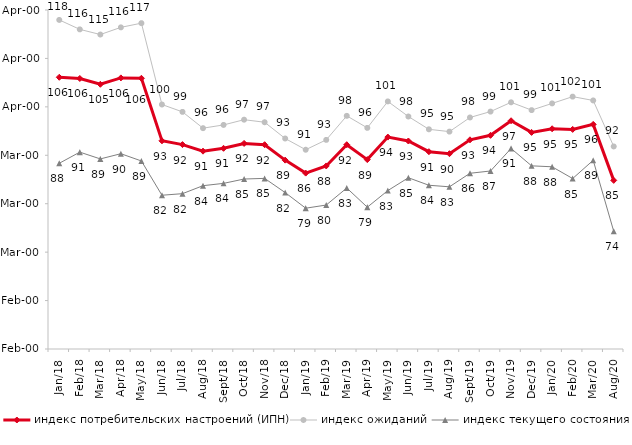
| Category | индекс потребительских настроений (ИПН) | Series 0 | индекс ожиданий | Series 3 | индекс текущего состояния |
|---|---|---|---|---|---|
| 2018-01-01 | 106.11 | 2018-01-01 | 117.95 | 2018-01-01 | 88.35 |
| 2018-02-01 | 105.86 | 2018-02-01 | 116 | 2018-02-01 | 90.65 |
| 2018-03-01 | 104.66 | 2018-03-01 | 114.933 | 2018-03-01 | 89.25 |
| 2018-04-01 | 105.98 | 2018-04-01 | 116.417 | 2018-04-01 | 90.325 |
| 2018-05-01 | 105.9 | 2018-05-01 | 117.283 | 2018-05-01 | 88.825 |
| 2018-06-01 | 92.99 | 2018-06-01 | 100.483 | 2018-06-01 | 81.75 |
| 2018-07-01 | 92.21 | 2018-07-01 | 98.967 | 2018-07-01 | 82.075 |
| 2018-08-01 | 90.85 | 2018-08-01 | 95.6 | 2018-08-01 | 83.725 |
| 2018-09-01 | 91.44 | 2018-09-01 | 96.267 | 2018-09-01 | 84.2 |
| 2018-10-01 | 92.45 | 2018-10-01 | 97.35 | 2018-10-01 | 85.1 |
| 2018-11-01 | 92.186 | 2018-11-01 | 96.823 | 2018-11-01 | 85.23 |
| 2018-12-01 | 89 | 2018-12-01 | 93.467 | 2018-12-01 | 82.3 |
| 2019-01-01 | 86.32 | 2019-01-01 | 91.15 | 2019-01-01 | 79.075 |
| 2019-02-01 | 87.8 | 2019-02-01 | 93.183 | 2019-02-01 | 79.725 |
| 2019-03-01 | 92.183 | 2019-03-01 | 98.144 | 2019-03-01 | 83.242 |
| 2019-04-01 | 89.109 | 2019-04-01 | 95.66 | 2019-04-01 | 79.282 |
| 2019-05-01 | 93.759 | 2019-05-01 | 101.123 | 2019-05-01 | 82.714 |
| 2019-06-01 | 92.948 | 2019-06-01 | 98.005 | 2019-06-01 | 85.362 |
| 2019-07-01 | 90.743 | 2019-07-01 | 95.363 | 2019-07-01 | 83.812 |
| 2019-08-01 | 90.33 | 2019-08-01 | 94.888 | 2019-08-01 | 83.492 |
| 2019-09-01 | 93.198 | 2019-09-01 | 97.805 | 2019-09-01 | 86.287 |
| 2019-10-01 | 94.119 | 2019-10-01 | 99.026 | 2019-10-01 | 86.757 |
| 2019-11-01 | 97.129 | 2019-11-01 | 100.941 | 2019-11-01 | 91.411 |
| 2019-12-01 | 94.723 | 2019-12-01 | 99.323 | 2019-12-01 | 87.822 |
| 2020-01-01 | 95.475 | 2020-01-01 | 100.71 | 2020-01-01 | 87.624 |
| 2020-02-01 | 95.347 | 2020-02-01 | 102.112 | 2020-02-01 | 85.198 |
| 2020-03-01 | 96.381 | 2020-03-01 | 101.322 | 2020-03-01 | 88.969 |
| 2020-08-01 | 84.816 | 2020-08-01 | 91.824 | 2020-08-01 | 74.305 |